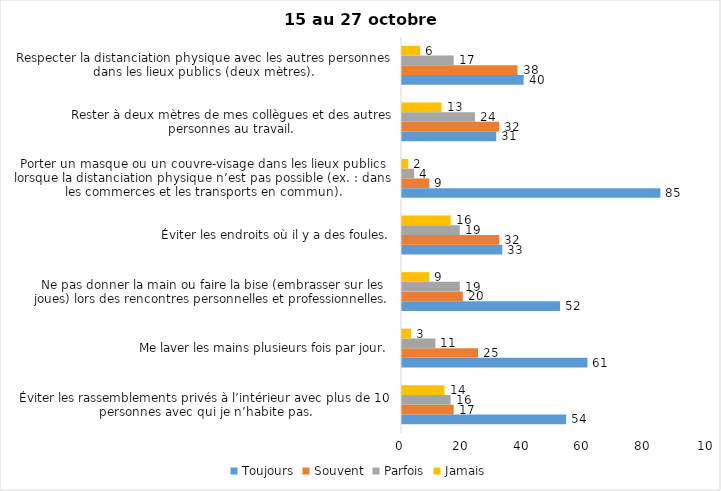
| Category | Toujours | Souvent | Parfois | Jamais |
|---|---|---|---|---|
| Éviter les rassemblements privés à l’intérieur avec plus de 10 personnes avec qui je n’habite pas. | 54 | 17 | 16 | 14 |
| Me laver les mains plusieurs fois par jour. | 61 | 25 | 11 | 3 |
| Ne pas donner la main ou faire la bise (embrasser sur les joues) lors des rencontres personnelles et professionnelles. | 52 | 20 | 19 | 9 |
| Éviter les endroits où il y a des foules. | 33 | 32 | 19 | 16 |
| Porter un masque ou un couvre-visage dans les lieux publics lorsque la distanciation physique n’est pas possible (ex. : dans les commerces et les transports en commun). | 85 | 9 | 4 | 2 |
| Rester à deux mètres de mes collègues et des autres personnes au travail. | 31 | 32 | 24 | 13 |
| Respecter la distanciation physique avec les autres personnes dans les lieux publics (deux mètres). | 40 | 38 | 17 | 6 |